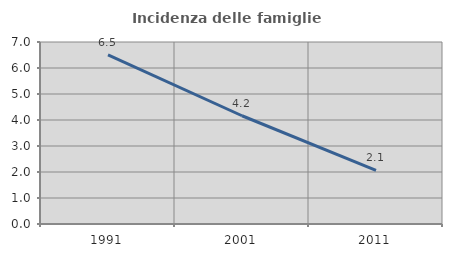
| Category | Incidenza delle famiglie numerose |
|---|---|
| 1991.0 | 6.509 |
| 2001.0 | 4.163 |
| 2011.0 | 2.065 |